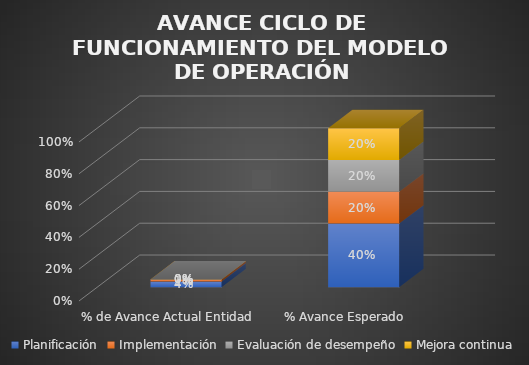
| Category | Planificación | Implementación | Evaluación de desempeño | Mejora continua |
|---|---|---|---|---|
| % de Avance Actual Entidad | 0.036 | 0.013 | 0 | 0 |
| % Avance Esperado | 0.4 | 0.2 | 0.2 | 0.2 |